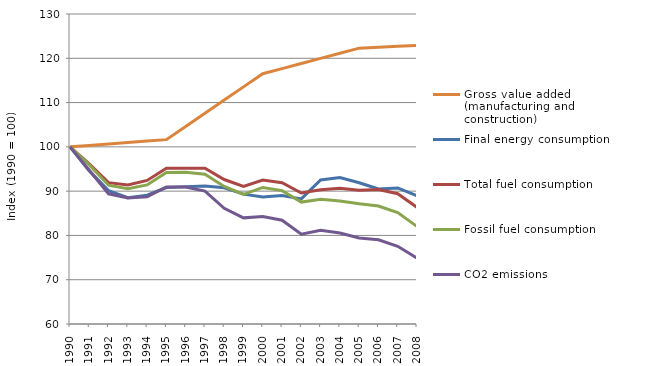
| Category | Gross value added (manufacturing and construction) | Final energy consumption | Total fuel consumption | Fossil fuel consumption | CO2 emissions |
|---|---|---|---|---|---|
| 1990.0 | 100 | 100 | 100 | 100 | 100 |
| 1991.0 | 100.326 | 94.573 | 96.168 | 95.923 | 94.715 |
| 1992.0 | 100.652 | 90.12 | 91.921 | 91.349 | 89.394 |
| 1993.0 | 100.979 | 88.536 | 91.388 | 90.568 | 88.444 |
| 1994.0 | 101.305 | 89.079 | 92.415 | 91.4 | 88.708 |
| 1995.0 | 101.631 | 90.806 | 95.179 | 94.218 | 90.954 |
| 1996.0 | 104.609 | 90.97 | 95.147 | 94.254 | 90.932 |
| 1997.0 | 107.587 | 91.161 | 95.161 | 93.804 | 90.028 |
| 1998.0 | 110.565 | 90.768 | 92.627 | 91.055 | 86.128 |
| 1999.0 | 113.543 | 89.328 | 91.089 | 89.272 | 83.968 |
| 2000.0 | 116.521 | 88.691 | 92.523 | 90.84 | 84.268 |
| 2001.0 | 117.674 | 89.02 | 91.889 | 90.122 | 83.432 |
| 2002.0 | 118.827 | 88.252 | 89.584 | 87.53 | 80.295 |
| 2003.0 | 119.98 | 92.53 | 90.289 | 88.174 | 81.159 |
| 2004.0 | 121.133 | 93.078 | 90.677 | 87.794 | 80.552 |
| 2005.0 | 122.286 | 91.902 | 90.206 | 87.149 | 79.441 |
| 2006.0 | 122.49 | 90.502 | 90.38 | 86.651 | 79.022 |
| 2007.0 | 122.694 | 90.727 | 89.408 | 85.147 | 77.548 |
| 2008.0 | 122.899 | 88.947 | 86.334 | 82.03 | 74.893 |